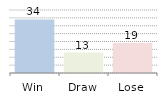
| Category | Series 0 |
|---|---|
| Win | 34 |
| Draw | 13 |
| Lose | 19 |